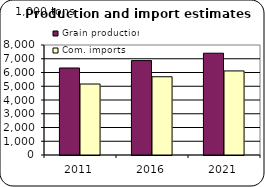
| Category | Grain production | Com. imports |
|---|---|---|
| 2011.0 | 6328.287 | 5161.668 |
| 2016.0 | 6865.833 | 5690.732 |
| 2021.0 | 7402.337 | 6113.743 |